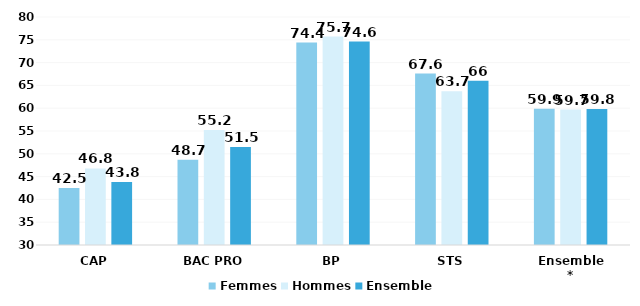
| Category | Femmes | Hommes | Ensemble |
|---|---|---|---|
| CAP | 42.5 | 46.8 | 43.8 |
| BAC PRO | 48.7 | 55.2 | 51.5 |
| BP | 74.4 | 75.7 | 74.6 |
| STS | 67.6 | 63.7 | 66 |
| Ensemble* | 59.9 | 59.7 | 59.8 |